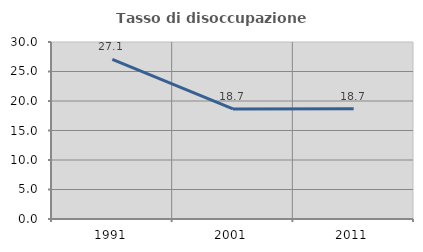
| Category | Tasso di disoccupazione giovanile  |
|---|---|
| 1991.0 | 27.072 |
| 2001.0 | 18.657 |
| 2011.0 | 18.681 |